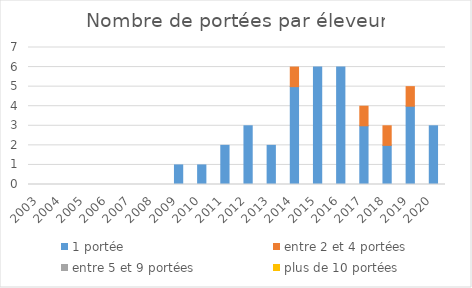
| Category | 1 portée | entre 2 et 4 portées | entre 5 et 9 portées | plus de 10 portées |
|---|---|---|---|---|
| 2003.0 | 0 | 0 | 0 | 0 |
| 2004.0 | 0 | 0 | 0 | 0 |
| 2005.0 | 0 | 0 | 0 | 0 |
| 2006.0 | 0 | 0 | 0 | 0 |
| 2007.0 | 0 | 0 | 0 | 0 |
| 2008.0 | 0 | 0 | 0 | 0 |
| 2009.0 | 1 | 0 | 0 | 0 |
| 2010.0 | 1 | 0 | 0 | 0 |
| 2011.0 | 2 | 0 | 0 | 0 |
| 2012.0 | 3 | 0 | 0 | 0 |
| 2013.0 | 2 | 0 | 0 | 0 |
| 2014.0 | 5 | 1 | 0 | 0 |
| 2015.0 | 6 | 0 | 0 | 0 |
| 2016.0 | 6 | 0 | 0 | 0 |
| 2017.0 | 3 | 1 | 0 | 0 |
| 2018.0 | 2 | 1 | 0 | 0 |
| 2019.0 | 4 | 1 | 0 | 0 |
| 2020.0 | 3 | 0 | 0 | 0 |